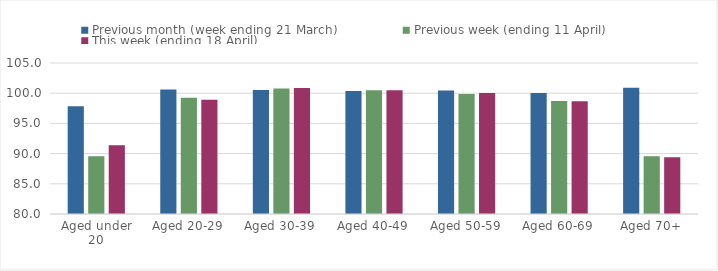
| Category | Previous month (week ending 21 March) | Previous week (ending 11 April) | This week (ending 18 April) |
|---|---|---|---|
| Aged under 20 | 97.852 | 89.542 | 91.398 |
| Aged 20-29 | 100.616 | 99.266 | 98.92 |
| Aged 30-39 | 100.512 | 100.765 | 100.881 |
| Aged 40-49 | 100.374 | 100.486 | 100.493 |
| Aged 50-59 | 100.435 | 99.876 | 100.045 |
| Aged 60-69 | 100.023 | 98.692 | 98.651 |
| Aged 70+ | 100.913 | 89.567 | 89.387 |